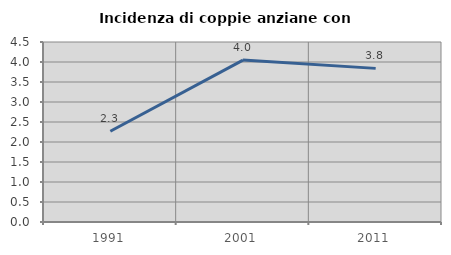
| Category | Incidenza di coppie anziane con figli |
|---|---|
| 1991.0 | 2.269 |
| 2001.0 | 4.048 |
| 2011.0 | 3.841 |